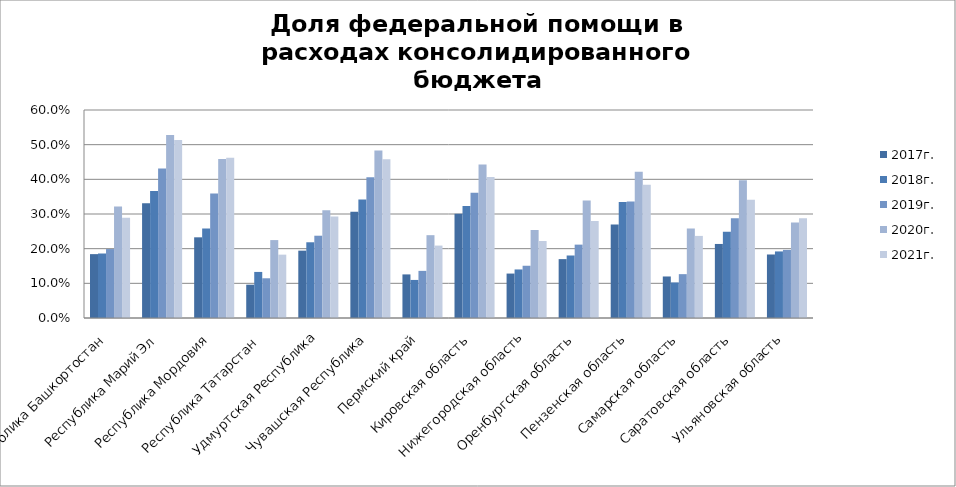
| Category | 2016г. | 2017г. | 2018г. | 2019г. | 2020г. | 2021г. |
|---|---|---|---|---|---|---|
| Республика Башкортостан |  | 0.184 | 0.186 | 0.199 | 0.321 | 0.289 |
| Республика Марий Эл |  | 0.331 | 0.366 | 0.431 | 0.528 | 0.513 |
| Республика Мордовия |  | 0.233 | 0.258 | 0.359 | 0.458 | 0.462 |
| Республика Татарстан  |  | 0.096 | 0.133 | 0.115 | 0.225 | 0.183 |
| Удмуртская Республика |  | 0.194 | 0.218 | 0.237 | 0.311 | 0.293 |
| Чувашская Республика |  | 0.306 | 0.342 | 0.406 | 0.483 | 0.458 |
| Пермский край |  | 0.126 | 0.11 | 0.136 | 0.239 | 0.209 |
| Кировская область |  | 0.301 | 0.323 | 0.361 | 0.443 | 0.407 |
| Нижегородская область |  | 0.128 | 0.14 | 0.151 | 0.254 | 0.222 |
| Оренбургская область |  | 0.17 | 0.18 | 0.212 | 0.339 | 0.28 |
| Пензенская область |  | 0.27 | 0.334 | 0.336 | 0.422 | 0.385 |
| Самарская область |  | 0.12 | 0.103 | 0.126 | 0.258 | 0.237 |
| Саратовская область |  | 0.214 | 0.249 | 0.288 | 0.398 | 0.341 |
| Ульяновская область |  | 0.183 | 0.192 | 0.197 | 0.276 | 0.288 |